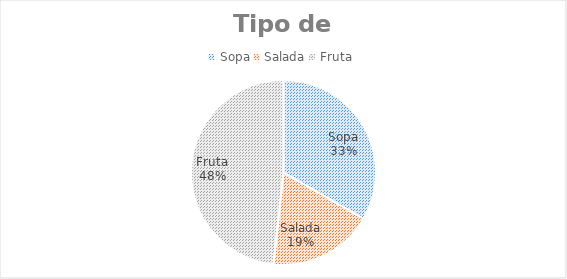
| Category | Alunos |
|---|---|
| Sopa | 29 |
| Salada | 16 |
| Fruta | 42 |